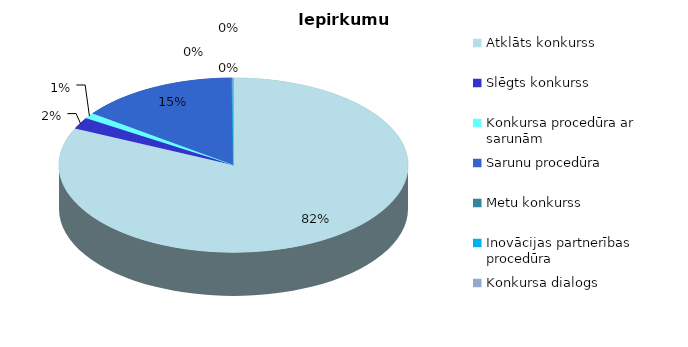
| Category | Iepirkumu skaits |
|---|---|
| Atklāts konkurss | 702 |
| Slēgts konkurss | 18 |
| Konkursa procedūra ar sarunām | 9 |
| Sarunu procedūra | 126 |
| Metu konkurss | 1 |
| Inovācijas partnerības procedūra | 0 |
| Konkursa dialogs | 1 |